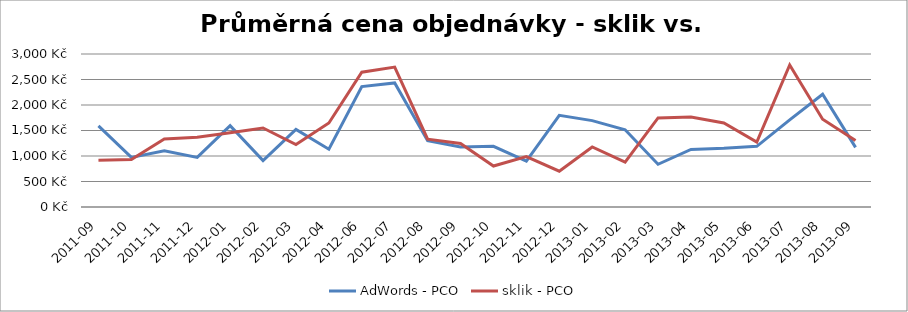
| Category | AdWords - PCO | sklik - PCO |
|---|---|---|
| 2011-09 | 1591.452 | 916.953 |
| 2011-10 | 971.465 | 931.673 |
| 2011-11 | 1103.382 | 1333.381 |
| 2011-12 | 973.255 | 1365.976 |
| 2012-01 | 1595.717 | 1456.622 |
| 2012-02 | 909.008 | 1549.688 |
| 2012-03 | 1519.967 | 1225.847 |
| 2012-04 | 1132.961 | 1646.844 |
| 2012-06 | 2360.439 | 2642.162 |
| 2012-07 | 2433.2 | 2742.861 |
| 2012-08 | 1301.163 | 1330.695 |
| 2012-09 | 1174.835 | 1244.578 |
| 2012-10 | 1190.149 | 803.113 |
| 2012-11 | 897.776 | 987.971 |
| 2012-12 | 1796.229 | 701.231 |
| 2013-01 | 1693.806 | 1176.804 |
| 2013-02 | 1513.671 | 879.207 |
| 2013-03 | 837.052 | 1745.524 |
| 2013-04 | 1129.299 | 1763.217 |
| 2013-05 | 1151.832 | 1647.355 |
| 2013-06 | 1189.983 | 1273.916 |
| 2013-07 | 1708.032 | 2783.817 |
| 2013-08 | 2211.199 | 1721.161 |
| 2013-09 | 1169.078 | 1306.142 |